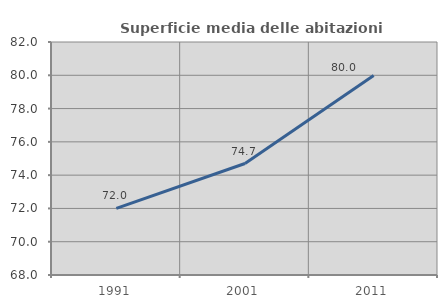
| Category | Superficie media delle abitazioni occupate |
|---|---|
| 1991.0 | 72.006 |
| 2001.0 | 74.697 |
| 2011.0 | 79.991 |